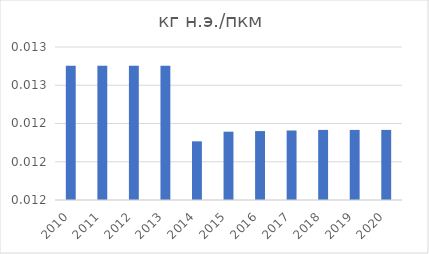
| Category | кг н.э./пкм |
|---|---|
| 2010.0 | 0.013 |
| 2011.0 | 0.013 |
| 2012.0 | 0.013 |
| 2013.0 | 0.013 |
| 2014.0 | 0.012 |
| 2015.0 | 0.012 |
| 2016.0 | 0.012 |
| 2017.0 | 0.012 |
| 2018.0 | 0.012 |
| 2019.0 | 0.012 |
| 2020.0 | 0.012 |